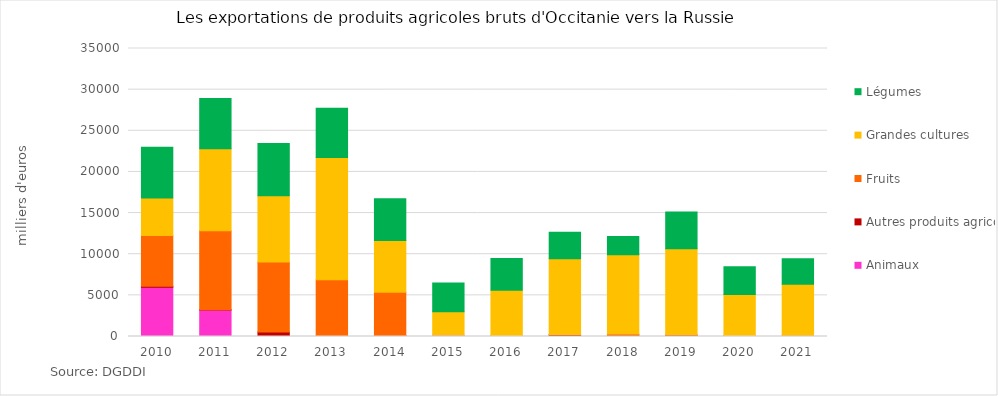
| Category | Animaux | Autres produits agricoles | Fruits | Grandes cultures | Légumes |
|---|---|---|---|---|---|
| 2010.0 | 5973.191 | 134.309 | 6170.581 | 4564.72 | 6143.414 |
| 2011.0 | 3207.145 | 38.565 | 9592.178 | 9971.347 | 6127.136 |
| 2012.0 | 21.145 | 524.697 | 8505.051 | 8060.799 | 6330.318 |
| 2013.0 | 11.829 | 22.312 | 6874.535 | 14852.105 | 5989.103 |
| 2014.0 | 67.576 | 49.475 | 5264.124 | 6278.966 | 5088.949 |
| 2015.0 | 163.588 | 0 | 0 | 2855.594 | 3482.503 |
| 2016.0 | 46.312 | 18.6 | 5.429 | 5545.151 | 3874.901 |
| 2017.0 | 41.212 | 162.76 | 49.669 | 9196.399 | 3220.279 |
| 2018.0 | 37.368 | 128.903 | 151.149 | 9609.484 | 2221.262 |
| 2019.0 | 54.938 | 117.199 | 34.531 | 10442.466 | 4479.332 |
| 2020.0 | 20.662 | 42.309 | 66.328 | 4967.596 | 3378.616 |
| 2021.0 | 0 | 7.537 | 135.224 | 6193.926 | 3125.955 |